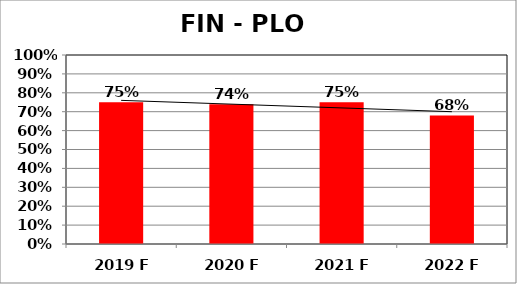
| Category | Series 0 |
|---|---|
| 2019 F | 0.75 |
| 2020 F | 0.74 |
| 2021 F | 0.75 |
| 2022 F | 0.68 |